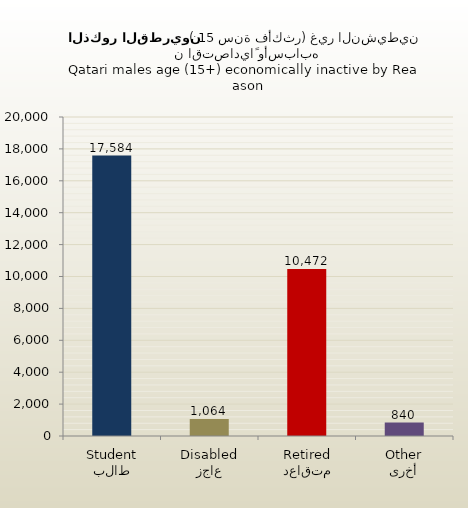
| Category | الذكور القطريين |
|---|---|
| طالب
Student | 17584 |
| عاجز
Disabled | 1064 |
| متقاعد
Retired | 10472 |
| أخرى
Other | 840 |